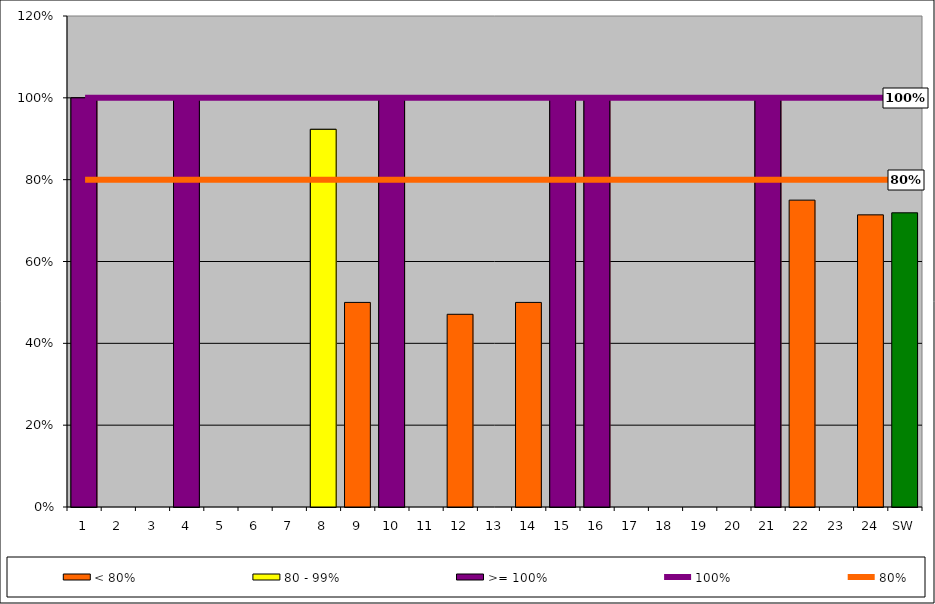
| Category | < 80% | 80 - 99% | >= 100% |
|---|---|---|---|
| 1 | 1 | 0 | 1 |
| 2 | 0 | 0 | 0 |
| 3 | 0 | 0 | 0 |
| 4 | 1 | 0 | 1 |
| 5 | 0 | 0 | 0 |
| 6 | 0 | 0 | 0 |
| 7 | 0 | 0 | 0 |
| 8 | 0.923 | 0.923 | 0 |
| 9 | 0.5 | 0 | 0 |
| 10 | 1 | 0 | 1 |
| 11 | 0 | 0 | 0 |
| 12 | 0.471 | 0 | 0 |
| 13 | 0 | 0 | 0 |
| 14 | 0.5 | 0 | 0 |
| 15 | 1 | 0 | 1 |
| 16 | 1 | 0 | 1 |
| 17 | 0 | 0 | 0 |
| 18 | 0 | 0 | 0 |
| 19 | 0 | 0 | 0 |
| 20 | 0 | 0 | 0 |
| 21 | 1 | 0 | 1 |
| 22 | 0.75 | 0 | 0 |
| 23 | 0 | 0 | 0 |
| 24 | 0.714 | 0 | 0 |
| SW | 0.719 | 0 | 0 |